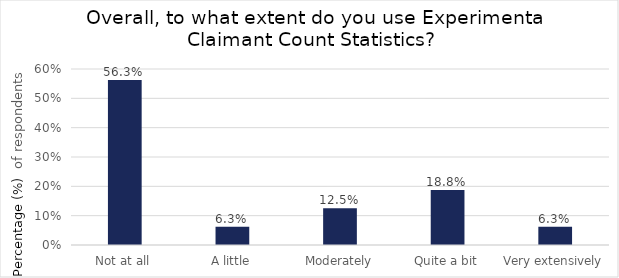
| Category | Series 0 |
|---|---|
| Not at all | 0.562 |
| A little | 0.062 |
| Moderately | 0.125 |
| Quite a bit | 0.188 |
| Very extensively | 0.062 |